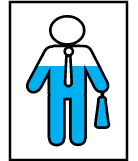
| Category | Series 0 | Series 1 |
|---|---|---|
| 0 | 0.6 | 0.6 |